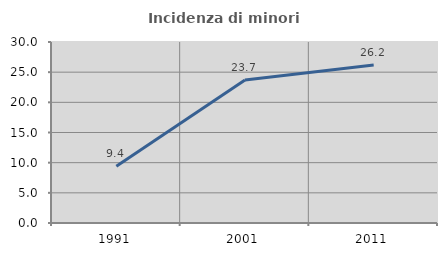
| Category | Incidenza di minori stranieri |
|---|---|
| 1991.0 | 9.412 |
| 2001.0 | 23.714 |
| 2011.0 | 26.176 |